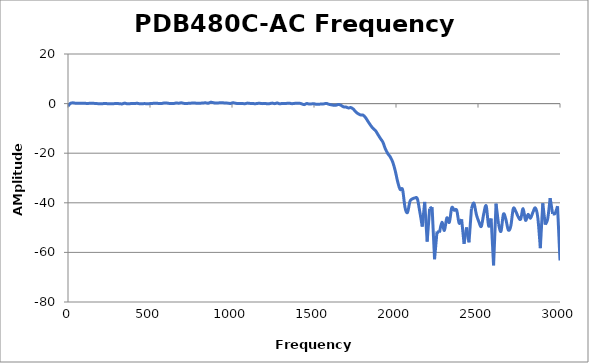
| Category | Series 0 |
|---|---|
| 0.3 | -0.992 |
| 15.2985 | 0.121 |
| 30.297 | 0.303 |
| 45.2955 | 0.162 |
| 60.294 | 0.166 |
| 75.2925 | 0.15 |
| 90.291 | 0.117 |
| 105.289 | 0.104 |
| 120.288 | 0.053 |
| 135.287 | 0.146 |
| 150.285 | 0.113 |
| 165.284 | 0.072 |
| 180.282 | -0.012 |
| 195.281 | -0.08 |
| 210.279 | -0.039 |
| 225.278 | 0.088 |
| 240.276 | -0.045 |
| 255.274 | -0.057 |
| 270.273 | -0.049 |
| 285.272 | 0 |
| 300.27 | 0.033 |
| 315.269 | -0.049 |
| 330.267 | -0.119 |
| 345.266 | 0.193 |
| 360.264 | -0.062 |
| 375.263 | -0.039 |
| 390.261 | 0.039 |
| 405.26 | 0 |
| 420.258 | 0.139 |
| 435.257 | -0.045 |
| 450.255 | -0.051 |
| 465.254 | -0.002 |
| 480.252 | -0.031 |
| 495.251 | -0.016 |
| 510.249 | 0.049 |
| 525.248 | 0.129 |
| 540.246 | 0.139 |
| 555.245 | 0.039 |
| 570.243 | 0.037 |
| 585.242 | 0.238 |
| 600.24 | 0.242 |
| 615.239 | 0.088 |
| 630.237 | 0.014 |
| 645.236 | 0.051 |
| 660.234 | 0.242 |
| 675.233 | 0.158 |
| 690.231 | 0.316 |
| 705.23 | 0.121 |
| 720.228 | 0.008 |
| 735.227 | 0.135 |
| 750.225 | 0.186 |
| 765.224 | 0.234 |
| 780.222 | 0.182 |
| 795.221 | 0.1 |
| 810.219 | 0.178 |
| 825.217 | 0.27 |
| 840.216 | 0.303 |
| 855.215 | 0.166 |
| 870.213 | 0.539 |
| 885.212 | 0.387 |
| 900.21 | 0.195 |
| 915.209 | 0.262 |
| 930.207 | 0.359 |
| 945.206 | 0.312 |
| 960.204 | 0.211 |
| 975.203 | 0.182 |
| 990.201 | 0.059 |
| 1005.2 | 0.33 |
| 1020.2 | 0.18 |
| 1035.2 | 0.006 |
| 1050.2 | 0.086 |
| 1065.19 | 0.014 |
| 1080.19 | -0.031 |
| 1095.19 | 0.197 |
| 1110.19 | 0.074 |
| 1125.19 | 0.078 |
| 1140.19 | -0.068 |
| 1155.19 | 0.078 |
| 1170.18 | 0.107 |
| 1185.18 | -0.012 |
| 1200.18 | 0.088 |
| 1215.18 | -0.082 |
| 1230.18 | -0.006 |
| 1245.18 | 0.203 |
| 1260.17 | -0.023 |
| 1275.17 | 0.24 |
| 1290.17 | -0.068 |
| 1305.17 | 0.033 |
| 1320.17 | 0.021 |
| 1335.17 | 0.102 |
| 1350.17 | 0.145 |
| 1365.16 | -0.029 |
| 1380.16 | 0.076 |
| 1395.16 | 0.172 |
| 1410.16 | 0.16 |
| 1425.16 | -0.09 |
| 1440.16 | -0.42 |
| 1455.16 | 0.029 |
| 1470.15 | -0.182 |
| 1485.15 | -0.119 |
| 1500.15 | -0.076 |
| 1515.15 | -0.293 |
| 1530.15 | -0.238 |
| 1545.15 | -0.176 |
| 1560.14 | -0.107 |
| 1575.14 | 0.082 |
| 1590.14 | -0.266 |
| 1605.14 | -0.48 |
| 1620.14 | -0.664 |
| 1635.14 | -0.635 |
| 1650.14 | -0.324 |
| 1665.13 | -0.721 |
| 1680.13 | -1.307 |
| 1695.13 | -1.398 |
| 1710.13 | -1.754 |
| 1725.13 | -1.605 |
| 1740.13 | -2.244 |
| 1755.12 | -3.372 |
| 1770.12 | -4.135 |
| 1785.12 | -4.578 |
| 1800.12 | -4.672 |
| 1815.12 | -5.725 |
| 1830.12 | -7.274 |
| 1845.12 | -8.768 |
| 1860.11 | -10.007 |
| 1875.11 | -10.907 |
| 1890.11 | -12.486 |
| 1905.11 | -14.08 |
| 1920.11 | -15.571 |
| 1935.11 | -18.236 |
| 1950.11 | -20.176 |
| 1965.1 | -21.5 |
| 1980.1 | -23.595 |
| 1995.1 | -27.019 |
| 2010.1 | -31.48 |
| 2025.1 | -34.611 |
| 2040.1 | -34.661 |
| 2055.1 | -41.92 |
| 2070.09 | -43.899 |
| 2085.09 | -39.398 |
| 2100.09 | -38.403 |
| 2115.09 | -38.063 |
| 2130.09 | -38.374 |
| 2145.09 | -43.612 |
| 2160.08 | -49.603 |
| 2175.08 | -39.646 |
| 2190.08 | -55.672 |
| 2205.08 | -42.322 |
| 2220.08 | -41.741 |
| 2235.08 | -62.771 |
| 2250.08 | -51.562 |
| 2265.07 | -51.98 |
| 2280.07 | -47.878 |
| 2295.07 | -51.138 |
| 2310.07 | -46.083 |
| 2325.07 | -47.863 |
| 2340.07 | -41.995 |
| 2355.07 | -43.028 |
| 2370.06 | -42.985 |
| 2385.06 | -48.223 |
| 2400.06 | -46.634 |
| 2415.06 | -56.536 |
| 2430.06 | -49.914 |
| 2445.06 | -55.943 |
| 2460.05 | -42.373 |
| 2475.05 | -40.125 |
| 2490.05 | -44.73 |
| 2505.05 | -47.637 |
| 2520.05 | -49.507 |
| 2535.05 | -44.431 |
| 2550.05 | -41.256 |
| 2565.04 | -49.358 |
| 2580.04 | -46.317 |
| 2595.04 | -65.226 |
| 2610.04 | -40.342 |
| 2625.04 | -48.537 |
| 2640.04 | -51.524 |
| 2655.04 | -44.592 |
| 2670.03 | -46.723 |
| 2685.03 | -50.981 |
| 2700.03 | -49.343 |
| 2715.03 | -42.375 |
| 2730.03 | -43.412 |
| 2745.03 | -45.667 |
| 2760.02 | -46.599 |
| 2775.02 | -42.341 |
| 2790.02 | -47.074 |
| 2805.02 | -44.676 |
| 2820.02 | -46.205 |
| 2835.02 | -43.812 |
| 2850.02 | -42.1 |
| 2865.01 | -46.171 |
| 2880.01 | -58.308 |
| 2895.01 | -40.176 |
| 2910.01 | -48.807 |
| 2925.01 | -46.447 |
| 2940.01 | -38.12 |
| 2955.0 | -44.437 |
| 2970.0 | -44.27 |
| 2985.0 | -41.39 |
| 3000.0 | -63.239 |